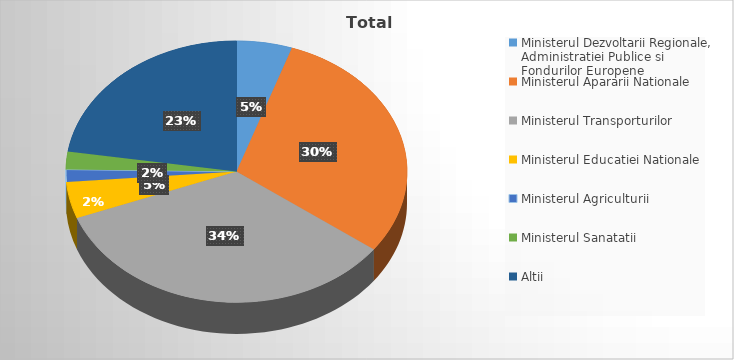
| Category | Series 0 |
|---|---|
| Ministerul Dezvoltarii Regionale, Administratiei Publice si Fondurilor Europene | 5.261 |
| Ministerul Apararii Nationale | 29.875 |
| Ministerul Transporturilor | 34.078 |
| Ministerul Educatiei Nationale | 4.528 |
| Ministerul Agriculturii | 1.508 |
| Ministerul Sanatatii | 2.214 |
| Altii | 22.536 |